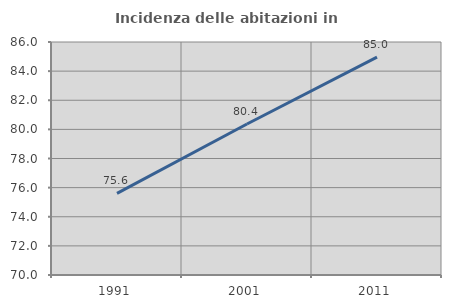
| Category | Incidenza delle abitazioni in proprietà  |
|---|---|
| 1991.0 | 75.61 |
| 2001.0 | 80.367 |
| 2011.0 | 84.958 |